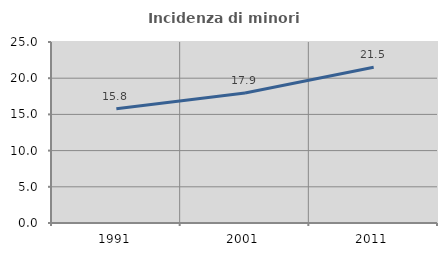
| Category | Incidenza di minori stranieri |
|---|---|
| 1991.0 | 15.789 |
| 2001.0 | 17.949 |
| 2011.0 | 21.505 |